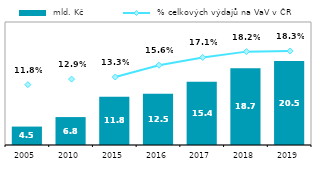
| Category |  mld. Kč |
|---|---|
| 2005.0 | 4.492 |
| 2010.0 | 6.811 |
| 2015.0 | 11.763 |
| 2016.0 | 12.477 |
| 2017.0 | 15.448 |
| 2018.0 | 18.72 |
| 2019.0 | 20.474 |